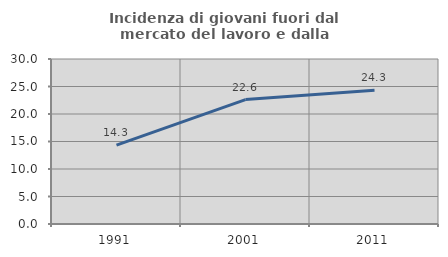
| Category | Incidenza di giovani fuori dal mercato del lavoro e dalla formazione  |
|---|---|
| 1991.0 | 14.348 |
| 2001.0 | 22.62 |
| 2011.0 | 24.321 |